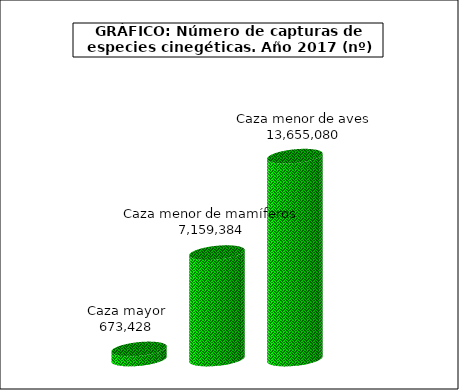
| Category | Cazar |
|---|---|
| Caza mayor | 673428 |
| Caza menor de mamíferos | 7159384 |
| Caza menor de aves | 13655080 |